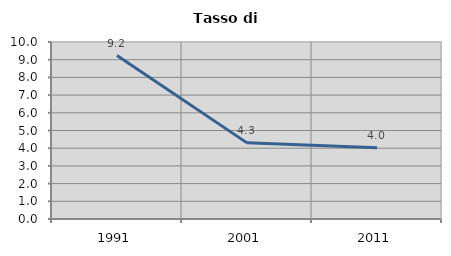
| Category | Tasso di disoccupazione   |
|---|---|
| 1991.0 | 9.236 |
| 2001.0 | 4.301 |
| 2011.0 | 4.031 |